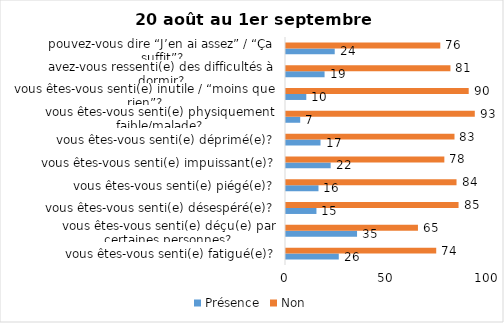
| Category | Présence | Non |
|---|---|---|
| vous êtes-vous senti(e) fatigué(e)? | 26 | 74 |
| vous êtes-vous senti(e) déçu(e) par certaines personnes? | 35 | 65 |
| vous êtes-vous senti(e) désespéré(e)? | 15 | 85 |
| vous êtes-vous senti(e) piégé(e)? | 16 | 84 |
| vous êtes-vous senti(e) impuissant(e)? | 22 | 78 |
| vous êtes-vous senti(e) déprimé(e)? | 17 | 83 |
| vous êtes-vous senti(e) physiquement faible/malade? | 7 | 93 |
| vous êtes-vous senti(e) inutile / “moins que rien”? | 10 | 90 |
| avez-vous ressenti(e) des difficultés à dormir? | 19 | 81 |
| pouvez-vous dire “J’en ai assez” / “Ça suffit”? | 24 | 76 |